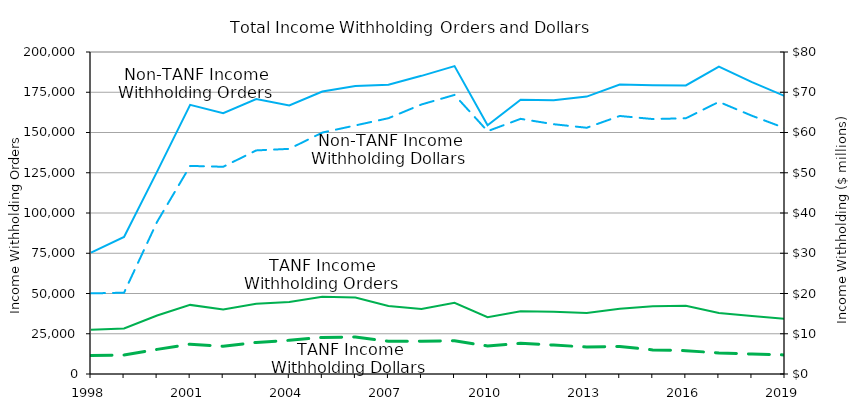
| Category | TANF Income Witholding Orders | Non-TANF Income Witholding Orders |
|---|---|---|
| 1998.0 | 27447 | 75412 |
| 1999.0 | 28229 | 85076 |
| 2000.0 | 36310 | 125690 |
| 2001.0 | 42921 | 167171 |
| 2002.0 | 40006 | 161942 |
| 2003.0 | 43691 | 170753 |
| 2004.0 | 44682 | 166743 |
| 2005.0 | 47973 | 175417 |
| 2006.0 | 47501 | 178903 |
| 2007.0 | 42217 | 179698 |
| 2008.0 | 40313 | 185192 |
| 2009.0 | 44178 | 191239 |
| 2010.0 | 35277 | 154530 |
| 2011.0 | 38948 | 170365 |
| 2012.0 | 38714 | 170027 |
| 2013.0 | 37824 | 172290 |
| 2014.0 | 40562 | 179765 |
| 2015.0 | 42064 | 179327 |
| 2016.0 | 42414 | 179257 |
| 2017.0 | 37959 | 190979 |
| 2018.0 | 36023.091 | 181239.071 |
| 2019.0 | 34293.983 | 172539.596 |